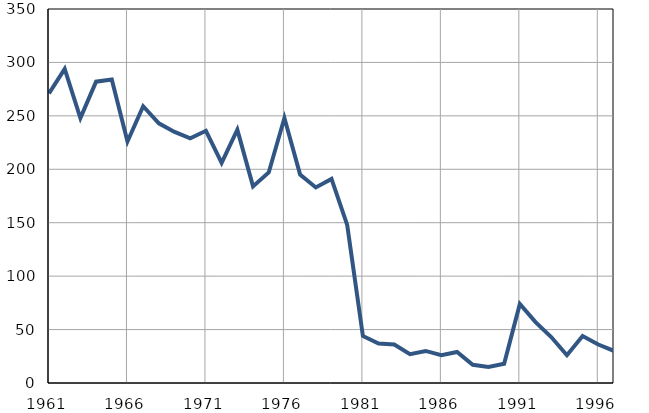
| Category | Умрла 
одојчад |
|---|---|
| 1961.0 | 271 |
| 1962.0 | 294 |
| 1963.0 | 248 |
| 1964.0 | 282 |
| 1965.0 | 284 |
| 1966.0 | 226 |
| 1967.0 | 259 |
| 1968.0 | 243 |
| 1969.0 | 235 |
| 1970.0 | 229 |
| 1971.0 | 236 |
| 1972.0 | 206 |
| 1973.0 | 237 |
| 1974.0 | 184 |
| 1975.0 | 197 |
| 1976.0 | 248 |
| 1977.0 | 195 |
| 1978.0 | 183 |
| 1979.0 | 191 |
| 1980.0 | 148 |
| 1981.0 | 44 |
| 1982.0 | 37 |
| 1983.0 | 36 |
| 1984.0 | 27 |
| 1985.0 | 30 |
| 1986.0 | 26 |
| 1987.0 | 29 |
| 1988.0 | 17 |
| 1989.0 | 15 |
| 1990.0 | 18 |
| 1991.0 | 74 |
| 1992.0 | 57 |
| 1993.0 | 43 |
| 1994.0 | 26 |
| 1995.0 | 44 |
| 1996.0 | 36 |
| 1997.0 | 30 |